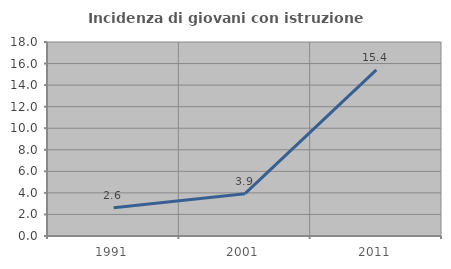
| Category | Incidenza di giovani con istruzione universitaria |
|---|---|
| 1991.0 | 2.62 |
| 2001.0 | 3.929 |
| 2011.0 | 15.412 |